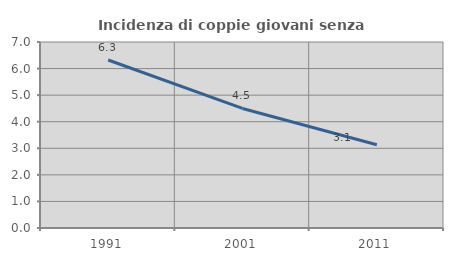
| Category | Incidenza di coppie giovani senza figli |
|---|---|
| 1991.0 | 6.323 |
| 2001.0 | 4.499 |
| 2011.0 | 3.134 |